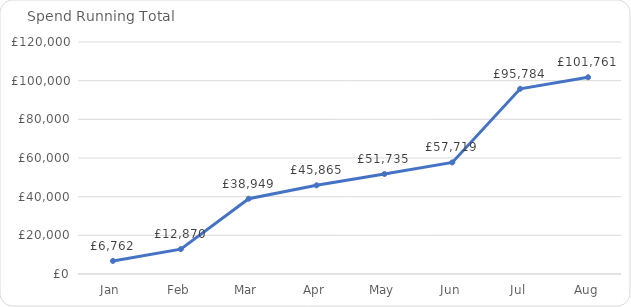
| Category | Total |
|---|---|
| Jan | 6762.3 |
| Feb | 12869.72 |
| Mar | 38948.62 |
| Apr | 45864.98 |
| May | 51734.52 |
| Jun | 57719.49 |
| Jul | 95784.14 |
| Aug | 101761.2 |